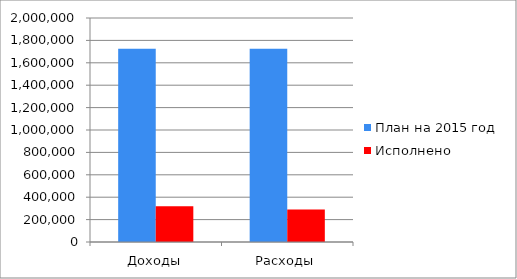
| Category | План на 2015 год | Исполнено  |
|---|---|---|
| Доходы | 1724792 | 319145 |
| Расходы | 1726294 | 290769 |